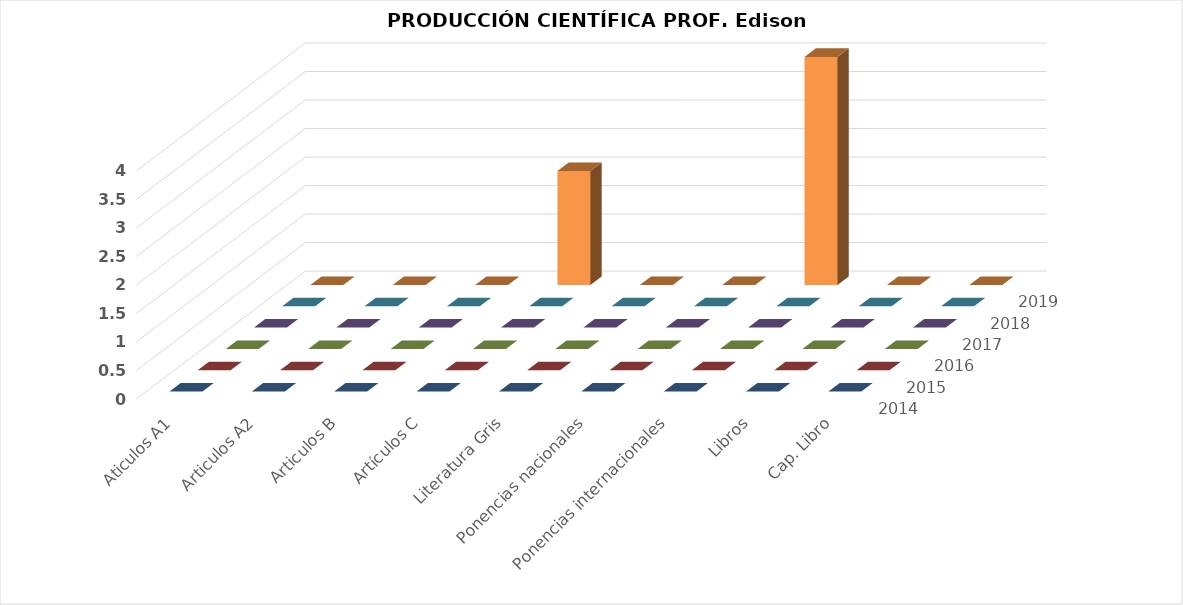
| Category | 2014 | 2015 | 2016 | 2017 | 2018 | 2019 |
|---|---|---|---|---|---|---|
| Aticulos A1 | 0 | 0 | 0 | 0 | 0 | 0 |
| Articulos A2 | 0 | 0 | 0 | 0 | 0 | 0 |
| Articulos B | 0 | 0 | 0 | 0 | 0 | 0 |
| Artículos C | 0 | 0 | 0 | 0 | 2 | 0 |
| Literatura Gris | 0 | 0 | 0 | 0 | 0 | 0 |
| Ponencias nacionales | 0 | 0 | 0 | 0 | 0 | 0 |
| Ponencias internacionales | 0 | 0 | 0 | 0 | 4 | 0 |
| Libros | 0 | 0 | 0 | 0 | 0 | 0 |
| Cap. Libro | 0 | 0 | 0 | 0 | 0 | 0 |